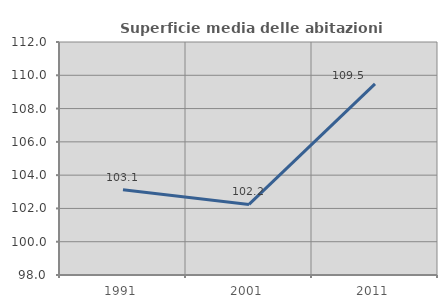
| Category | Superficie media delle abitazioni occupate |
|---|---|
| 1991.0 | 103.123 |
| 2001.0 | 102.242 |
| 2011.0 | 109.487 |